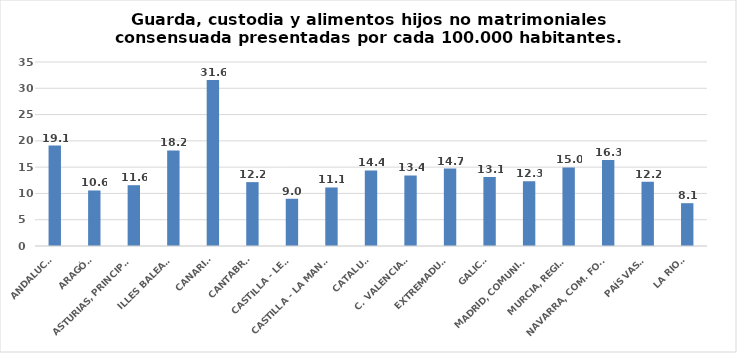
| Category | Series 0 |
|---|---|
| ANDALUCÍA | 19.097 |
| ARAGÓN | 10.563 |
| ASTURIAS, PRINCIPADO | 11.566 |
| ILLES BALEARS | 18.169 |
| CANARIAS | 31.593 |
| CANTABRIA | 12.151 |
| CASTILLA - LEÓN | 8.987 |
| CASTILLA - LA MANCHA | 11.134 |
| CATALUÑA | 14.374 |
| C. VALENCIANA | 13.427 |
| EXTREMADURA | 14.734 |
| GALICIA | 13.139 |
| MADRID, COMUNIDAD | 12.334 |
| MURCIA, REGIÓN | 14.954 |
| NAVARRA, COM. FORAL | 16.338 |
| PAÍS VASCO | 12.203 |
| LA RIOJA | 8.145 |